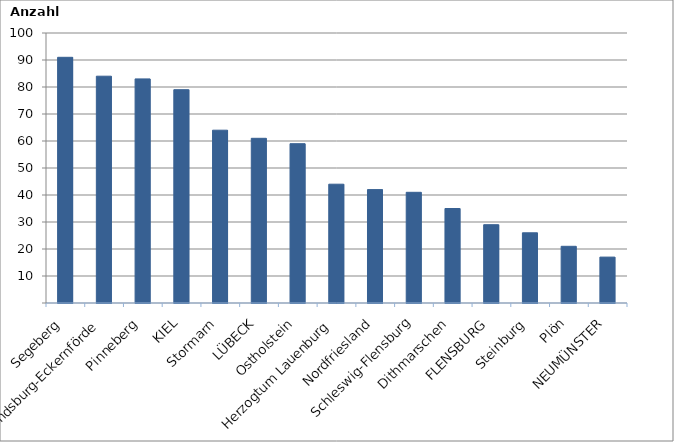
| Category | Series 0 |
|---|---|
| Segeberg | 91 |
| Rendsburg-Eckernförde | 84 |
| Pinneberg | 83 |
| KIEL | 79 |
| Stormarn | 64 |
| LÜBECK | 61 |
| Ostholstein | 59 |
| Herzogtum Lauenburg | 44 |
| Nordfriesland | 42 |
| Schleswig-Flensburg | 41 |
| Dithmarschen | 35 |
| FLENSBURG | 29 |
| Steinburg | 26 |
| Plön | 21 |
| NEUMÜNSTER | 17 |